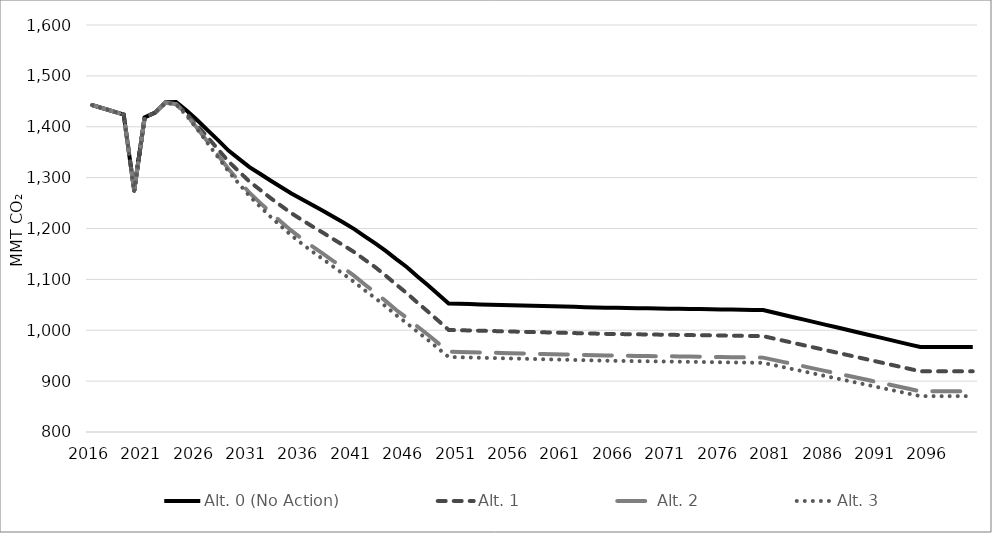
| Category | Alt. 0 (No Action) | Alt. 1 | Alt. 2 | Alt. 3 |
|---|---|---|---|---|
| 2016.0 | 1442.585 | 1442.585 | 1442.585 | 1442.585 |
| 2017.0 | 1436.387 | 1436.387 | 1436.387 | 1436.387 |
| 2018.0 | 1430.189 | 1430.189 | 1430.189 | 1430.189 |
| 2019.0 | 1423.991 | 1423.991 | 1423.991 | 1423.991 |
| 2020.0 | 1274.517 | 1274.517 | 1274.517 | 1274.517 |
| 2021.0 | 1418.525 | 1418.525 | 1418.525 | 1418.525 |
| 2022.0 | 1427.681 | 1427.681 | 1427.681 | 1427.681 |
| 2023.0 | 1448.226 | 1447.672 | 1447.305 | 1447.174 |
| 2024.0 | 1448.629 | 1445.284 | 1444.403 | 1443.93 |
| 2025.0 | 1431.878 | 1425.433 | 1422.783 | 1421.937 |
| 2026.0 | 1413.129 | 1402.969 | 1397.494 | 1395.67 |
| 2027.0 | 1393.37 | 1379.366 | 1370.787 | 1367.954 |
| 2028.0 | 1373.672 | 1355.69 | 1343.902 | 1340.109 |
| 2029.0 | 1353.14 | 1331.663 | 1316.869 | 1312.183 |
| 2030.0 | 1336.92 | 1311.948 | 1293.429 | 1287.841 |
| 2031.0 | 1320.579 | 1292.265 | 1270.263 | 1263.804 |
| 2032.0 | 1307.585 | 1276.22 | 1250.812 | 1243.381 |
| 2033.0 | 1294.275 | 1260.016 | 1231.448 | 1223.266 |
| 2034.0 | 1281.646 | 1244.882 | 1213.37 | 1204.561 |
| 2035.0 | 1268.782 | 1230.014 | 1195.744 | 1186.371 |
| 2036.0 | 1257.372 | 1216.892 | 1180.075 | 1170.067 |
| 2037.0 | 1245.976 | 1204.072 | 1164.936 | 1154.456 |
| 2038.0 | 1234.995 | 1191.884 | 1150.792 | 1139.894 |
| 2039.0 | 1223.053 | 1178.993 | 1136.09 | 1124.898 |
| 2040.0 | 1211.219 | 1166.487 | 1121.699 | 1109.992 |
| 2041.0 | 1198.777 | 1153.498 | 1106.74 | 1094.644 |
| 2042.0 | 1184.675 | 1138.629 | 1089.903 | 1078.452 |
| 2043.0 | 1170.6 | 1123.897 | 1073.99 | 1063.151 |
| 2044.0 | 1155.828 | 1107.314 | 1057.285 | 1046.839 |
| 2045.0 | 1139.771 | 1089.755 | 1039.75 | 1029.62 |
| 2046.0 | 1124.447 | 1072.998 | 1024.429 | 1014.047 |
| 2047.0 | 1106.184 | 1054.681 | 1007.812 | 997.383 |
| 2048.0 | 1088.988 | 1037.064 | 991.542 | 981.222 |
| 2049.0 | 1070.836 | 1018.966 | 974.678 | 964.254 |
| 2050.0 | 1052.479 | 1000.598 | 957.839 | 947.434 |
| 2051.0 | 1051.938 | 1000.084 | 957.347 | 946.947 |
| 2052.0 | 1051.398 | 999.57 | 956.854 | 946.46 |
| 2053.0 | 1050.857 | 999.056 | 956.362 | 945.973 |
| 2054.0 | 1050.316 | 998.541 | 955.87 | 945.486 |
| 2055.0 | 1049.775 | 998.027 | 955.378 | 944.999 |
| 2056.0 | 1049.234 | 997.513 | 954.885 | 944.512 |
| 2057.0 | 1048.693 | 996.999 | 954.393 | 944.025 |
| 2058.0 | 1048.152 | 996.484 | 953.901 | 943.538 |
| 2059.0 | 1047.611 | 995.97 | 953.409 | 943.051 |
| 2060.0 | 1047.07 | 995.456 | 952.916 | 942.564 |
| 2061.0 | 1046.529 | 994.942 | 952.424 | 942.077 |
| 2062.0 | 1045.988 | 994.427 | 951.932 | 941.59 |
| 2063.0 | 1045.447 | 993.913 | 951.439 | 941.104 |
| 2064.0 | 1044.907 | 993.399 | 950.947 | 940.617 |
| 2065.0 | 1044.366 | 992.885 | 950.455 | 940.13 |
| 2066.0 | 1044.054 | 992.588 | 950.171 | 939.849 |
| 2067.0 | 1043.742 | 992.291 | 949.887 | 939.568 |
| 2068.0 | 1043.43 | 991.995 | 949.603 | 939.287 |
| 2069.0 | 1043.118 | 991.698 | 949.319 | 939.006 |
| 2070.0 | 1042.806 | 991.402 | 949.035 | 938.725 |
| 2071.0 | 1042.494 | 991.105 | 948.751 | 938.445 |
| 2072.0 | 1042.182 | 990.808 | 948.467 | 938.164 |
| 2073.0 | 1041.87 | 990.512 | 948.183 | 937.883 |
| 2074.0 | 1041.558 | 990.215 | 947.899 | 937.602 |
| 2075.0 | 1041.246 | 989.919 | 947.616 | 937.321 |
| 2076.0 | 1040.934 | 989.622 | 947.332 | 937.04 |
| 2077.0 | 1040.622 | 989.325 | 947.048 | 936.759 |
| 2078.0 | 1040.31 | 989.029 | 946.764 | 936.479 |
| 2079.0 | 1039.998 | 988.732 | 946.48 | 936.198 |
| 2080.0 | 1039.686 | 988.435 | 946.196 | 935.917 |
| 2081.0 | 1034.84 | 983.829 | 941.786 | 931.555 |
| 2082.0 | 1029.995 | 979.222 | 937.376 | 927.193 |
| 2083.0 | 1025.149 | 974.615 | 932.966 | 922.831 |
| 2084.0 | 1020.303 | 970.009 | 928.556 | 918.469 |
| 2085.0 | 1015.458 | 965.402 | 924.147 | 914.107 |
| 2086.0 | 1010.612 | 960.795 | 919.737 | 909.745 |
| 2087.0 | 1005.767 | 956.189 | 915.327 | 905.383 |
| 2088.0 | 1000.921 | 951.582 | 910.917 | 901.021 |
| 2089.0 | 996.076 | 946.975 | 906.507 | 896.659 |
| 2090.0 | 991.23 | 942.368 | 902.097 | 892.297 |
| 2091.0 | 986.384 | 937.762 | 897.687 | 887.936 |
| 2092.0 | 981.539 | 933.155 | 893.278 | 883.574 |
| 2093.0 | 976.693 | 928.548 | 888.868 | 879.212 |
| 2094.0 | 971.848 | 923.942 | 884.458 | 874.85 |
| 2095.0 | 967.002 | 919.335 | 880.048 | 870.488 |
| 2096.0 | 967.002 | 919.335 | 880.048 | 870.488 |
| 2097.0 | 967.002 | 919.335 | 880.048 | 870.488 |
| 2098.0 | 967.002 | 919.335 | 880.048 | 870.488 |
| 2099.0 | 967.002 | 919.335 | 880.048 | 870.488 |
| 2100.0 | 967.002 | 919.335 | 880.048 | 870.488 |